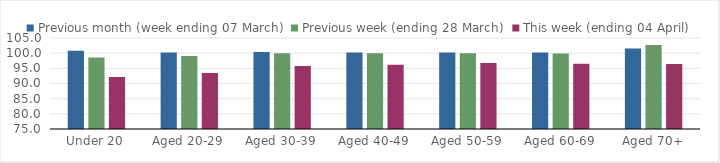
| Category | Previous month (week ending 07 March) | Previous week (ending 28 March) | This week (ending 04 April) |
|---|---|---|---|
| Under 20 | 100.832 | 98.571 | 92.128 |
| Aged 20-29 | 100.238 | 99.036 | 93.47 |
| Aged 30-39 | 100.416 | 99.981 | 95.781 |
| Aged 40-49 | 100.24 | 99.961 | 96.214 |
| Aged 50-59 | 100.224 | 99.971 | 96.741 |
| Aged 60-69 | 100.229 | 99.869 | 96.498 |
| Aged 70+ | 101.556 | 102.697 | 96.457 |